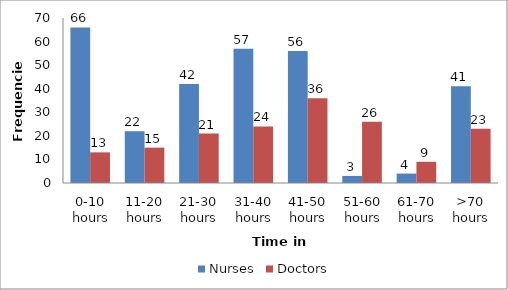
| Category | Nurses | Doctors |
|---|---|---|
| 0-10 hours | 66 | 13 |
| 11-20 hours | 22 | 15 |
| 21-30 hours | 42 | 21 |
| 31-40 hours | 57 | 24 |
| 41-50 hours | 56 | 36 |
| 51-60 hours | 3 | 26 |
| 61-70 hours | 4 | 9 |
| >70 hours | 41 | 23 |